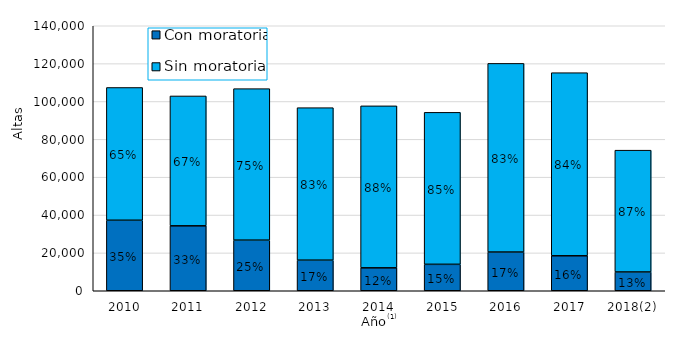
| Category | Con moratoria | Sin moratoria |
|---|---|---|
| 2010 | 37246 | 70142 |
| 2011 | 34303 | 68613 |
| 2012 | 26736 | 80047 |
| 2013 | 16157 | 80569 |
| 2014 | 12110 | 85574 |
| 2015 | 13964 | 80289 |
| 2016 | 20454 | 99663 |
| 2017 | 18481 | 96724 |
| 2018(2) | 9915 | 64354 |